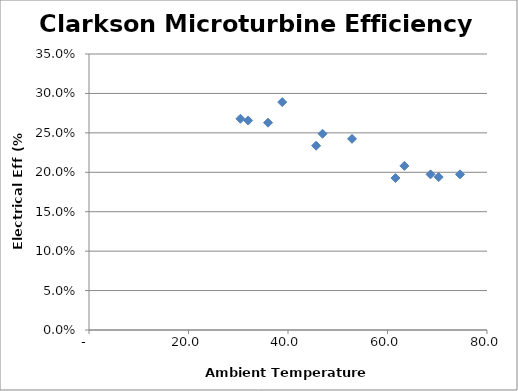
| Category | Series 0 |
|---|---|
| 30.4454 | 0.268 |
| 31.9903 | 0.266 |
| 46.9388 | 0.249 |
| 45.6581 | 0.234 |
| 63.3978 | 0.208 |
| 68.6542 | 0.197 |
| 74.5715 | 0.197 |
| 70.2889 | 0.194 |
| 61.6058 | 0.193 |
| 52.8709 | 0.242 |
| 38.846 | 0.289 |
| 35.9876 | 0.263 |